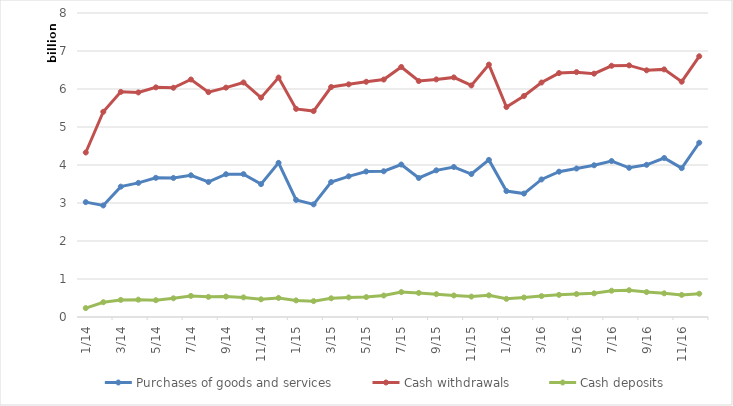
| Category | Purchases of goods and services | Cash withdrawals | Cash deposits |
|---|---|---|---|
| 2014-01-01 | 3022416360 | 4329221413 | 234202602 |
| 2014-02-01 | 2935573003 | 5400579592 | 389374332 |
| 2014-03-01 | 3430519343 | 5924330695 | 449812040 |
| 2014-04-01 | 3528683474 | 5909541153 | 456423871 |
| 2014-05-01 | 3662184878 | 6043024513 | 442083625 |
| 2014-06-01 | 3659241623 | 6032844340 | 491917835 |
| 2014-07-01 | 3729356428 | 6249956104 | 554333811 |
| 2014-08-01 | 3553475749 | 5916947506 | 529898018 |
| 2014-09-01 | 3756830312 | 6036217833 | 537264756 |
| 2014-10-01 | 3759695479 | 6171709747 | 515847868 |
| 2014-11-01 | 3496662715 | 5773259979 | 465332686 |
| 2014-12-01 | 4056822940 | 6301275832 | 501845433 |
| 2015-01-01 | 3080564316 | 5476843516 | 436617439 |
| 2015-02-01 | 2964313470 | 5418434882 | 417287822 |
| 2015-03-01 | 3552104565 | 6052489543 | 492464658 |
| 2015-04-01 | 3702068050 | 6122379943 | 514337992 |
| 2015-05-01 | 3828574763 | 6190017708 | 524095603 |
| 2015-06-01 | 3835521387 | 6248662051 | 565129556 |
| 2015-07-01 | 4012894534 | 6579631148 | 656316630 |
| 2015-08-01 | 3658519203 | 6209743784 | 633884976 |
| 2015-09-01 | 3859902726 | 6252505593 | 600857451 |
| 2015-10-01 | 3947769268 | 6305183969 | 566211452 |
| 2015-11-01 | 3762645579 | 6093796652 | 536946459 |
| 2015-12-01 | 4134324224 | 6641008685 | 570373441 |
| 2016-01-01 | 3313356181 | 5526440661 | 477949973 |
| 2016-02-01 | 3248269214 | 5816226861 | 512324963 |
| 2016-03-01 | 3619679238 | 6169984547 | 549662940 |
| 2016-04-01 | 3823999818 | 6419433107 | 582376393 |
| 2016-05-01 | 3907500543 | 6443747480 | 604150152 |
| 2016-06-01 | 3992803732 | 6404009850 | 622163959 |
| 2016-07-01 | 4104443392 | 6611263838 | 691690069 |
| 2016-08-01 | 3925959988 | 6621351165 | 705232805 |
| 2016-09-01 | 4005295393 | 6491524452 | 655447842 |
| 2016-10-01 | 4184310295 | 6516178632 | 622806180 |
| 2016-11-01 | 3916622974 | 6192076994 | 581315199 |
| 2016-12-01 | 4585676699 | 6860960168 | 612347745 |